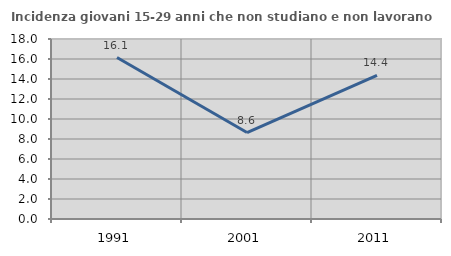
| Category | Incidenza giovani 15-29 anni che non studiano e non lavorano  |
|---|---|
| 1991.0 | 16.144 |
| 2001.0 | 8.645 |
| 2011.0 | 14.36 |